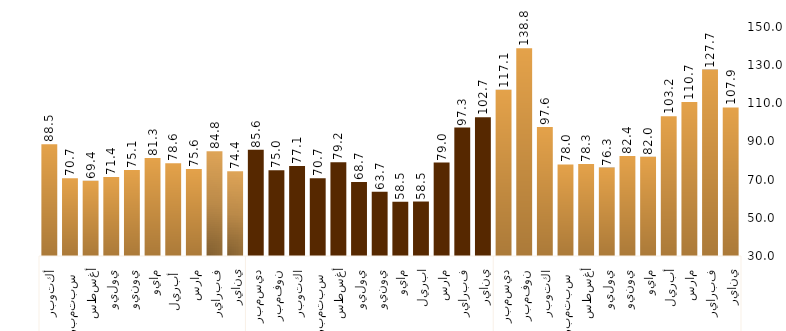
| Category | Series 0 |
|---|---|
| 0 | 107.861 |
| 1 | 127.674 |
| 2 | 110.742 |
| 3 | 103.239 |
| 4 | 82.016 |
| 5 | 82.421 |
| 6 | 76.314 |
| 7 | 78.265 |
| 8 | 77.961 |
| 9 | 97.566 |
| 10 | 138.85 |
| 11 | 117.091 |
| 12 | 102.678 |
| 13 | 97.332 |
| 14 | 78.955 |
| 15 | 58.549 |
| 16 | 58.455 |
| 17 | 63.691 |
| 18 | 68.721 |
| 19 | 79.161 |
| 20 | 70.692 |
| 21 | 77.111 |
| 22 | 74.955 |
| 23 | 85.627 |
| 24 | 74.378 |
| 25 | 84.831 |
| 26 | 75.573 |
| 27 | 78.621 |
| 28 | 81.312 |
| 29 | 75.092 |
| 30 | 71.411 |
| 31 | 69.374 |
| 32 | 70.7 |
| 33 | 88.5 |